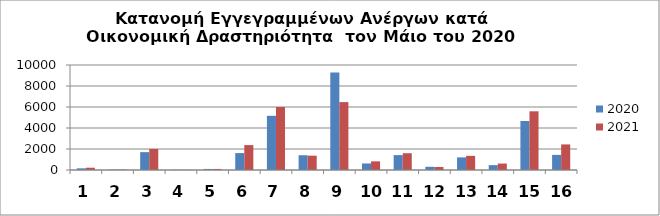
| Category | 2020 | 2021 |
|---|---|---|
| 0 | 159 | 217 |
| 1 | 39 | 46 |
| 2 | 1700 | 2002 |
| 3 | 15 | 16 |
| 4 | 100 | 101 |
| 5 | 1611 | 2373 |
| 6 | 5162 | 6002 |
| 7 | 1405 | 1364 |
| 8 | 9293 | 6467 |
| 9 | 624 | 824 |
| 10 | 1418 | 1598 |
| 11 | 306 | 288 |
| 12 | 1202 | 1348 |
| 13 | 463 | 614 |
| 14 | 4668 | 5591 |
| 15 | 1439 | 2436 |